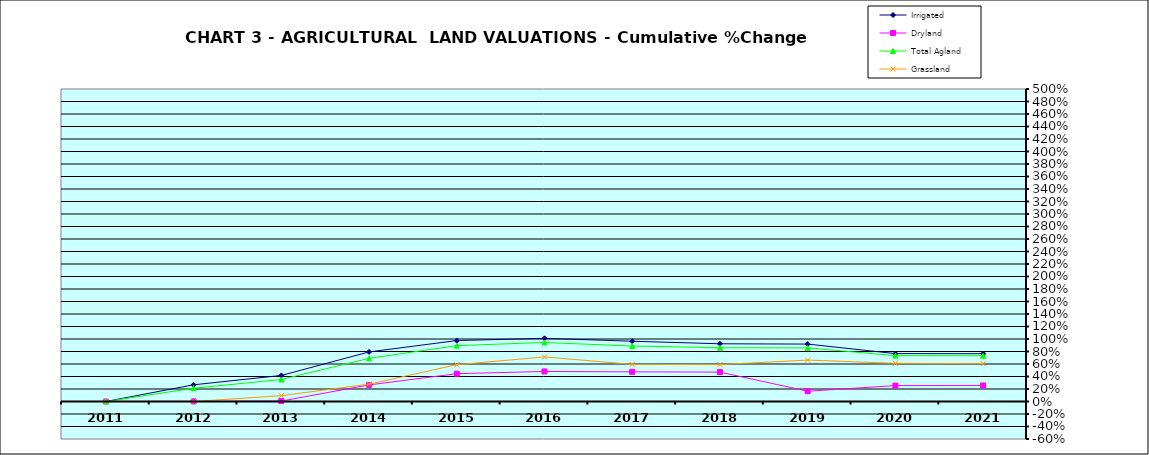
| Category | Irrigated | Dryland | Total Agland | Grassland |
|---|---|---|---|---|
| 2011.0 | 0 | 0 | 0 | 0 |
| 2012.0 | 0.267 | 0.002 | 0.212 | -0.001 |
| 2013.0 | 0.417 | 0.007 | 0.352 | 0.094 |
| 2014.0 | 0.793 | 0.265 | 0.69 | 0.277 |
| 2015.0 | 0.975 | 0.445 | 0.894 | 0.589 |
| 2016.0 | 1.011 | 0.481 | 0.944 | 0.713 |
| 2017.0 | 0.964 | 0.474 | 0.887 | 0.594 |
| 2018.0 | 0.923 | 0.471 | 0.86 | 0.591 |
| 2019.0 | 0.919 | 0.164 | 0.857 | 0.663 |
| 2020.0 | 0.766 | 0.255 | 0.734 | 0.611 |
| 2021.0 | 0.765 | 0.257 | 0.732 | 0.606 |